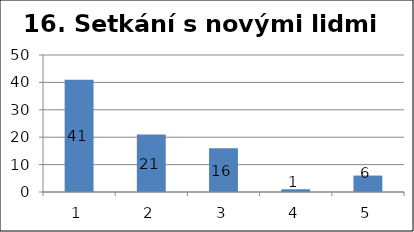
| Category | Series 1 |
|---|---|
| 0 | 41 |
| 1 | 21 |
| 2 | 16 |
| 3 | 1 |
| 4 | 6 |